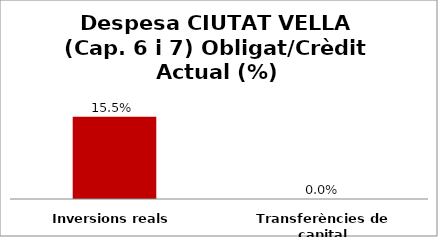
| Category | Series 0 |
|---|---|
| Inversions reals | 0.155 |
| Transferències de capital | 0 |